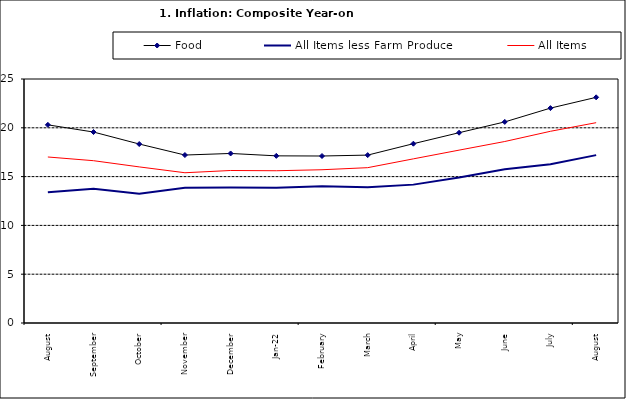
| Category | Food | All Items less Farm Produce | All Items |
|---|---|---|---|
| August | 20.303 | 13.408 | 17.009 |
| September | 19.566 | 13.745 | 16.63 |
| October | 18.338 | 13.24 | 15.994 |
| November | 17.209 | 13.851 | 15.396 |
| December | 17.37 | 13.873 | 15.625 |
| Jan-22 | 17.126 | 13.869 | 15.601 |
| February | 17.11 | 14.011 | 15.702 |
| March | 17.203 | 13.914 | 15.915 |
| April | 18.371 | 14.178 | 16.819 |
| May | 19.496 | 14.897 | 17.712 |
| June | 20.603 | 15.747 | 18.596 |
| July | 22.017 | 16.258 | 19.643 |
| August | 23.121 | 17.2 | 20.525 |